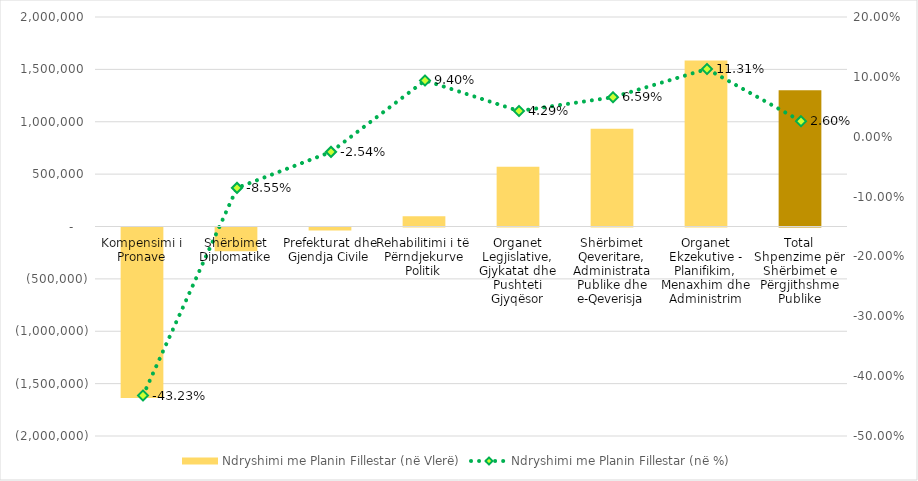
| Category | Ndryshimi me Planin Fillestar (në Vlerë) |
|---|---|
| Kompensimi i Pronave | -1628000 |
| Shërbimet Diplomatike | -227000 |
| Prefekturat dhe Gjendja Civile | -29784 |
| Rehabilitimi i të Përndjekurve Politik | 97400 |
| Organet Legjislative, Gjykatat dhe Pushteti Gjyqësor | 570790.379 |
| Shërbimet Qeveritare, Administrata Publike dhe e-Qeverisja | 933204 |
| Organet Ekzekutive - Planifikim, Menaxhim dhe Administrim | 1584060.621 |
| Total Shpenzime për Shërbimet e Përgjithshme Publike | 1300671 |